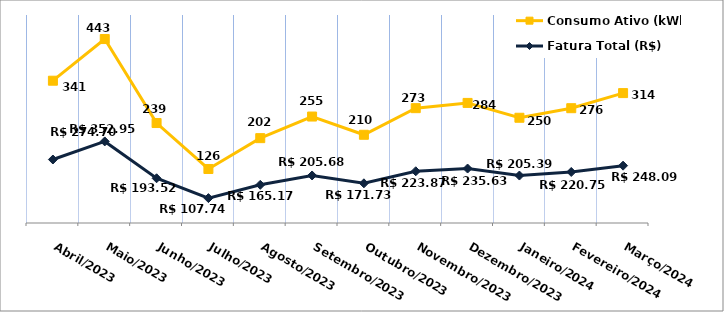
| Category | Fatura Total (R$) | Consumo Ativo (kWh) |
|---|---|---|
| Abril/2023 | 274.7 | 341 |
| Maio/2023 | 352.95 | 443 |
| Junho/2023 | 193.52 | 239 |
| Julho/2023 | 107.74 | 126 |
| Agosto/2023 | 165.17 | 202 |
| Setembro/2023 | 205.68 | 255 |
| Outubro/2023 | 171.73 | 210 |
| Novembro/2023 | 223.87 | 273 |
| Dezembro/2023 | 235.63 | 284 |
| Janeiro/2024 | 205.39 | 250 |
| Fevereiro/2024 | 220.75 | 276 |
| Março/2024 | 248.09 | 314 |